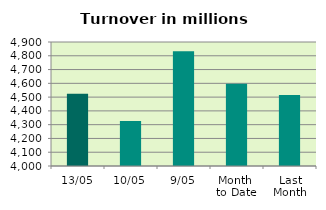
| Category | Series 0 |
|---|---|
| 13/05 | 4524.274 |
| 10/05 | 4325.946 |
| 9/05 | 4833.128 |
| Month 
to Date | 4597.813 |
| Last
Month | 4514.737 |